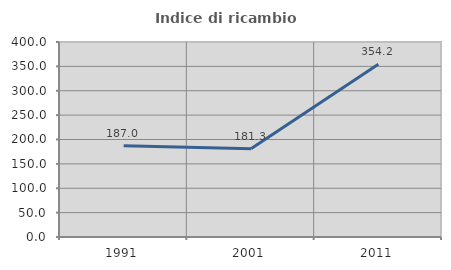
| Category | Indice di ricambio occupazionale  |
|---|---|
| 1991.0 | 186.957 |
| 2001.0 | 181.25 |
| 2011.0 | 354.167 |